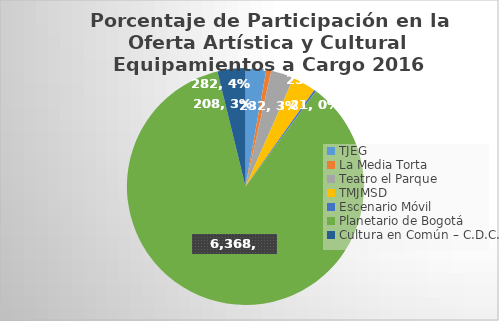
| Category | Series 0 |
|---|---|
| TJEG | 208 |
| La Media Torta | 51 |
| Teatro el Parque | 232 |
| TMJMSD | 238 |
| Escenario Móvil | 21 |
| Planetario de Bogotá | 6368 |
| Cultura en Común – C.D.C. | 282 |